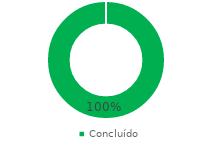
| Category | Total |
|---|---|
| Concluído | 1 |